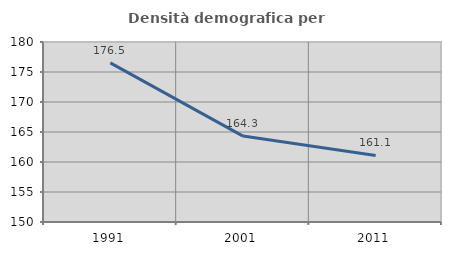
| Category | Densità demografica |
|---|---|
| 1991.0 | 176.513 |
| 2001.0 | 164.316 |
| 2011.0 | 161.091 |